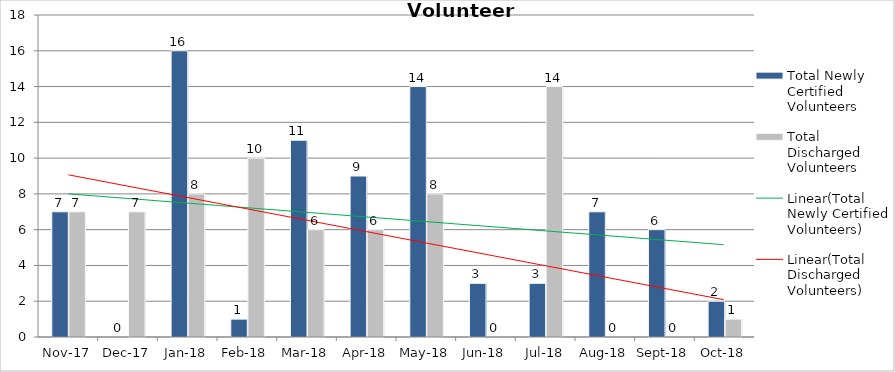
| Category | Total Newly Certified Volunteers | Total Discharged Volunteers |
|---|---|---|
| 2017-11-01 | 7 | 7 |
| 2017-12-01 | 0 | 7 |
| 2018-01-01 | 16 | 8 |
| 2018-02-01 | 1 | 10 |
| 2018-03-01 | 11 | 6 |
| 2018-04-01 | 9 | 6 |
| 2018-05-01 | 14 | 8 |
| 2018-06-01 | 3 | 0 |
| 2018-07-01 | 3 | 14 |
| 2018-08-01 | 7 | 0 |
| 2018-09-01 | 6 | 0 |
| 2018-10-01 | 2 | 1 |